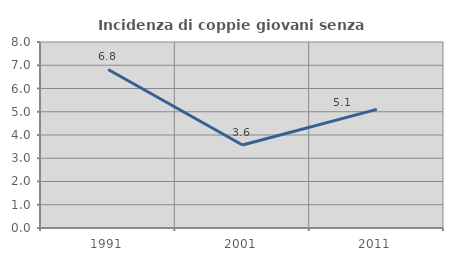
| Category | Incidenza di coppie giovani senza figli |
|---|---|
| 1991.0 | 6.818 |
| 2001.0 | 3.571 |
| 2011.0 | 5.102 |